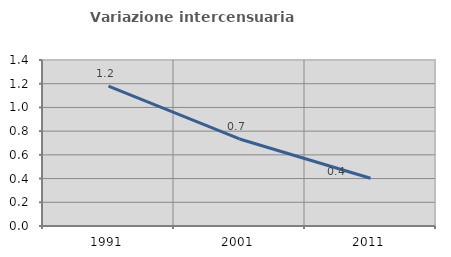
| Category | Variazione intercensuaria annua |
|---|---|
| 1991.0 | 1.179 |
| 2001.0 | 0.734 |
| 2011.0 | 0.403 |